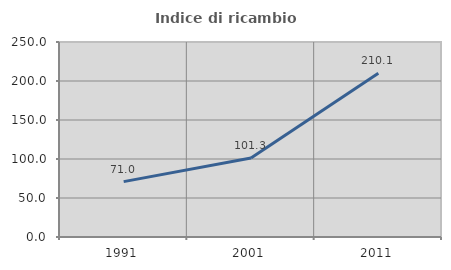
| Category | Indice di ricambio occupazionale  |
|---|---|
| 1991.0 | 70.992 |
| 2001.0 | 101.314 |
| 2011.0 | 210.068 |